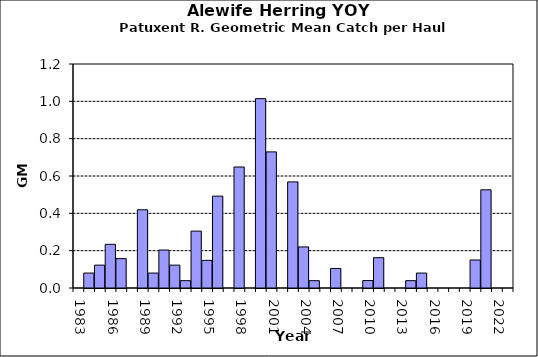
| Category | Series 0 |
|---|---|
| 1983.0 | 0 |
| 1984.0 | 0.08 |
| 1985.0 | 0.122 |
| 1986.0 | 0.234 |
| 1987.0 | 0.157 |
| 1988.0 | 0 |
| 1989.0 | 0.419 |
| 1990.0 | 0.08 |
| 1991.0 | 0.203 |
| 1992.0 | 0.122 |
| 1993.0 | 0.039 |
| 1994.0 | 0.305 |
| 1995.0 | 0.148 |
| 1996.0 | 0.492 |
| 1997.0 | 0 |
| 1998.0 | 0.648 |
| 1999.0 | 0 |
| 2000.0 | 1.014 |
| 2001.0 | 0.729 |
| 2002.0 | 0 |
| 2003.0 | 0.568 |
| 2004.0 | 0.22 |
| 2005.0 | 0.039 |
| 2006.0 | 0 |
| 2007.0 | 0.105 |
| 2008.0 | 0 |
| 2009.0 | 0 |
| 2010.0 | 0.04 |
| 2011.0 | 0.162 |
| 2012.0 | 0 |
| 2013.0 | 0 |
| 2014.0 | 0.039 |
| 2015.0 | 0.08 |
| 2016.0 | 0 |
| 2017.0 | 0 |
| 2018.0 | 0 |
| 2019.0 | 0 |
| 2020.0 | 0.15 |
| 2021.0 | 0.526 |
| 2022.0 | 0 |
| 2023.0 | 0 |